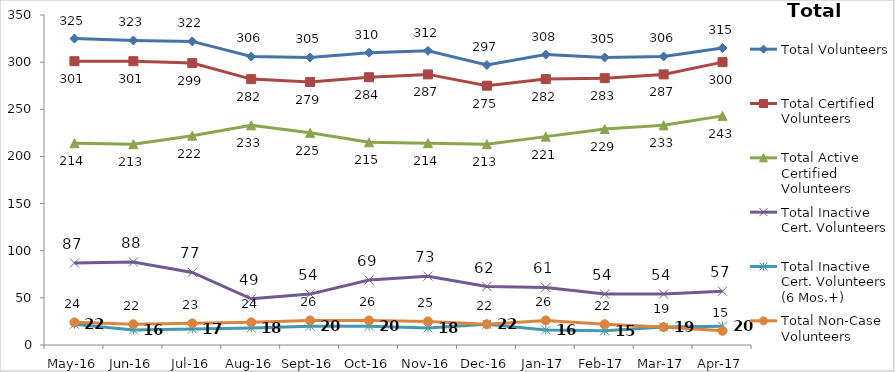
| Category | Total Volunteers | Total Certified Volunteers | Total Active Certified Volunteers | Total Inactive Cert. Volunteers | Total Inactive Cert. Volunteers (6 Mos.+) | Total Non-Case Volunteers |
|---|---|---|---|---|---|---|
| May-16 | 325 | 301 | 214 | 87 | 22 | 24 |
| Jun-16 | 323 | 301 | 213 | 88 | 16 | 22 |
| Jul-16 | 322 | 299 | 222 | 77 | 17 | 23 |
| Aug-16 | 306 | 282 | 233 | 49 | 18 | 24 |
| Sep-16 | 305 | 279 | 225 | 54 | 20 | 26 |
| Oct-16 | 310 | 284 | 215 | 69 | 20 | 26 |
| Nov-16 | 312 | 287 | 214 | 73 | 18 | 25 |
| Dec-16 | 297 | 275 | 213 | 62 | 22 | 22 |
| Jan-17 | 308 | 282 | 221 | 61 | 16 | 26 |
| Feb-17 | 305 | 283 | 229 | 54 | 15 | 22 |
| Mar-17 | 306 | 287 | 233 | 54 | 19 | 19 |
| Apr-17 | 315 | 300 | 243 | 57 | 20 | 15 |